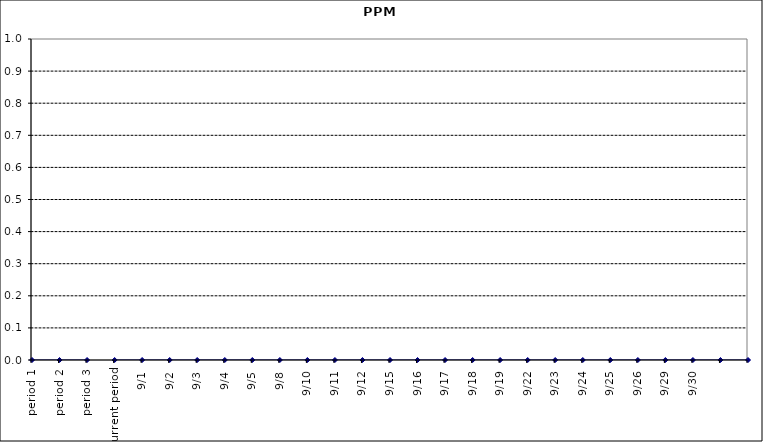
| Category | Series 0 |
|---|---|
| period 1 | 0 |
| period 2 | 0 |
| period 3 | 0 |
| current period | 0 |
| 9/1 | 0 |
| 9/2 | 0 |
| 9/3 | 0 |
| 9/4 | 0 |
| 9/5 | 0 |
| 9/8 | 0 |
| 9/10 | 0 |
| 9/11 | 0 |
| 9/12 | 0 |
| 9/15 | 0 |
| 9/16 | 0 |
| 9/17 | 0 |
| 9/18 | 0 |
| 9/19 | 0 |
| 9/22 | 0 |
| 9/23 | 0 |
| 9/24 | 0 |
| 9/25 | 0 |
| 9/26 | 0 |
| 9/29 | 0 |
| 9/30 | 0 |